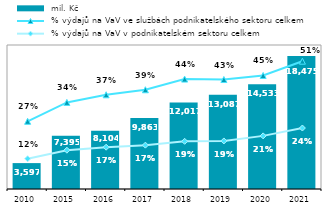
| Category |  mil. Kč |
|---|---|
| 2010.0 | 3597.172 |
| 2015.0 | 7394.736 |
| 2016.0 | 8103.91 |
| 2017.0 | 9863.017 |
| 2018.0 | 12016.964 |
| 2019.0 | 13086.503 |
| 2020.0 | 14532.76 |
| 2021.0 | 18475.41 |